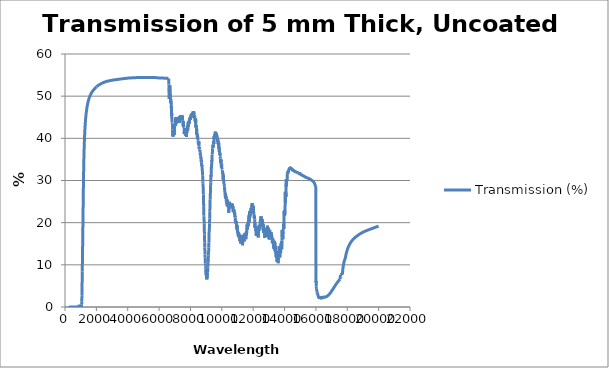
| Category | Transmission (%) |
|---|---|
| 200.0 | 0.035 |
| 210.0 | 0.001 |
| 220.0 | 0.003 |
| 230.0 | 0.002 |
| 240.0 | 0.006 |
| 250.0 | 0.004 |
| 260.0 | 0.007 |
| 270.0 | 0.01 |
| 280.0 | 0.009 |
| 290.0 | 0.01 |
| 300.0 | 0.008 |
| 310.0 | 0.002 |
| 320.0 | 0 |
| 330.0 | 0.002 |
| 340.0 | 0.003 |
| 350.0 | 0.001 |
| 360.0 | 0.004 |
| 370.0 | 0.001 |
| 380.0 | 0 |
| 390.0 | 0.001 |
| 400.0 | 0 |
| 410.0 | 0.002 |
| 420.0 | 0.002 |
| 430.0 | 0.002 |
| 440.0 | 0.003 |
| 450.0 | 0.001 |
| 460.0 | 0.001 |
| 470.0 | 0.006 |
| 480.0 | 0.008 |
| 490.0 | 0.001 |
| 500.0 | 0 |
| 510.0 | 0.003 |
| 520.0 | 0.005 |
| 530.0 | 0.008 |
| 540.0 | 0.008 |
| 550.0 | 0.003 |
| 560.0 | 0.001 |
| 570.0 | 0.005 |
| 580.0 | 0.006 |
| 590.0 | 0.004 |
| 600.0 | 0.006 |
| 610.0 | 0.007 |
| 620.0 | 0.005 |
| 630.0 | 0.007 |
| 640.0 | 0.005 |
| 650.0 | 0.003 |
| 660.0 | 0.006 |
| 670.0 | 0.006 |
| 680.0 | 0.003 |
| 690.0 | 0.005 |
| 700.0 | 0.006 |
| 710.0 | 0.004 |
| 720.0 | 0.006 |
| 730.0 | 0.007 |
| 740.0 | 0.004 |
| 750.0 | 0.005 |
| 760.0 | 0.005 |
| 770.0 | 0.003 |
| 780.0 | 0.005 |
| 790.0 | 0.005 |
| 800.0 | 0.005 |
| 810.0 | 0.005 |
| 820.0 | 0.003 |
| 830.0 | 0.006 |
| 840.0 | 0.005 |
| 850.0 | 0.025 |
| 860.0 | 0.058 |
| 870.0 | 0.173 |
| 880.0 | 0.228 |
| 890.0 | 0.239 |
| 900.0 | 0.217 |
| 910.0 | 0.198 |
| 920.0 | 0.178 |
| 930.0 | 0.204 |
| 940.0 | 0.229 |
| 950.0 | 0.2 |
| 960.0 | 0.166 |
| 970.0 | 0.136 |
| 980.0 | 0.11 |
| 990.0 | 0.09 |
| 1000.0 | 0.073 |
| 1010.0 | 0.096 |
| 1020.0 | 0.149 |
| 1030.0 | 0.175 |
| 1040.0 | 0.192 |
| 1050.0 | 0.255 |
| 1060.0 | 0.54 |
| 1070.0 | 1.258 |
| 1080.0 | 2.666 |
| 1090.0 | 5.006 |
| 1100.0 | 8.44 |
| 1110.0 | 10.669 |
| 1120.0 | 13.213 |
| 1130.0 | 15.979 |
| 1140.0 | 18.865 |
| 1150.0 | 21.82 |
| 1160.0 | 24.784 |
| 1170.0 | 27.65 |
| 1180.0 | 30.31 |
| 1190.0 | 32.607 |
| 1200.0 | 34.524 |
| 1210.0 | 36.13 |
| 1220.0 | 37.499 |
| 1230.0 | 38.69 |
| 1240.0 | 39.722 |
| 1250.0 | 40.62 |
| 1260.0 | 41.416 |
| 1270.0 | 42.127 |
| 1280.0 | 42.772 |
| 1290.0 | 43.359 |
| 1300.0 | 43.896 |
| 1310.0 | 44.389 |
| 1320.0 | 44.831 |
| 1330.0 | 45.226 |
| 1340.0 | 45.583 |
| 1350.0 | 45.913 |
| 1360.0 | 46.223 |
| 1370.0 | 46.508 |
| 1380.0 | 46.792 |
| 1390.0 | 47.058 |
| 1400.0 | 47.299 |
| 1410.0 | 47.528 |
| 1420.0 | 47.741 |
| 1430.0 | 47.939 |
| 1440.0 | 48.125 |
| 1450.0 | 48.299 |
| 1460.0 | 48.465 |
| 1470.0 | 48.625 |
| 1480.0 | 48.776 |
| 1490.0 | 48.919 |
| 1500.0 | 49.055 |
| 1510.0 | 49.184 |
| 1520.0 | 49.308 |
| 1530.0 | 49.426 |
| 1540.0 | 49.539 |
| 1550.0 | 49.647 |
| 1560.0 | 49.749 |
| 1570.0 | 49.847 |
| 1580.0 | 49.942 |
| 1590.0 | 50.034 |
| 1600.0 | 50.122 |
| 1610.0 | 50.207 |
| 1620.0 | 50.288 |
| 1630.0 | 50.365 |
| 1640.0 | 50.439 |
| 1650.0 | 50.512 |
| 1660.0 | 50.582 |
| 1670.0 | 50.65 |
| 1680.0 | 50.716 |
| 1690.0 | 50.78 |
| 1700.0 | 50.842 |
| 1710.0 | 50.903 |
| 1720.0 | 50.961 |
| 1730.0 | 51.015 |
| 1740.0 | 51.069 |
| 1750.0 | 51.122 |
| 1760.0 | 51.179 |
| 1770.0 | 51.244 |
| 1780.0 | 51.304 |
| 1790.0 | 51.353 |
| 1800.0 | 51.399 |
| 1810.0 | 51.442 |
| 1820.0 | 51.484 |
| 1830.0 | 51.526 |
| 1840.0 | 51.571 |
| 1850.0 | 51.612 |
| 1860.0 | 51.651 |
| 1870.0 | 51.703 |
| 1880.0 | 51.742 |
| 1890.0 | 51.773 |
| 1900.0 | 51.804 |
| 1910.0 | 51.835 |
| 1920.0 | 51.879 |
| 1930.0 | 51.927 |
| 1940.0 | 51.975 |
| 1950.0 | 52.021 |
| 1960.0 | 52.061 |
| 1970.0 | 52.1 |
| 1980.0 | 52.133 |
| 1990.0 | 52.164 |
| 2000.0 | 52.195 |
| 2000.06583409128 | 52.226 |
| 2009.94266750759 | 52.257 |
| 2020.09856612705 | 52.289 |
| 2029.96929826891 | 52.319 |
| 2039.8370004275 | 52.348 |
| 2049.98346034472 | 52.373 |
| 2059.84497072619 | 52.399 |
| 2069.98503080197 | 52.424 |
| 2079.84028883395 | 52.454 |
| 2089.97388678498 | 52.483 |
| 2099.82283193349 | 52.51 |
| 2109.94990551615 | 52.538 |
| 2120.0736471999 | 52.56 |
| 2129.91296429671 | 52.584 |
| 2140.03008788415 | 52.608 |
| 2149.86294050753 | 52.631 |
| 2159.97338385621 | 52.651 |
| 2169.79971160982 | 52.675 |
| 2179.90341261835 | 52.697 |
| 2190.00367126184 | 52.718 |
| 2199.82005175428 | 52.741 |
| 2209.91347454654 | 52.764 |
| 2220.00340758378 | 52.79 |
| 2229.80970387416 | 52.811 |
| 2239.89270764445 | 52.83 |
| 2249.97217431841 | 52.851 |
| 2259.76824960652 | 52.875 |
| 2269.84069369447 | 52.895 |
| 2279.90955339415 | 52.919 |
| 2289.97481280544 | 52.938 |
| 2299.75701491494 | 52.955 |
| 2309.81512717729 | 52.975 |
| 2319.86959192627 | 52.994 |
| 2329.92039328452 | 53.016 |
| 2339.6884784778 | 53.037 |
| 2349.73200830224 | 53.058 |
| 2359.77182757912 | 53.076 |
| 2369.80792045418 | 53.093 |
| 2379.84027107906 | 53.112 |
| 2389.86886361131 | 53.128 |
| 2399.89368221442 | 53.142 |
| 2409.63640045946 | 53.161 |
| 2419.65372964289 | 53.178 |
| 2429.66723786282 | 53.196 |
| 2439.67690930653 | 53.214 |
| 2449.6827281674 | 53.228 |
| 2459.68467864487 | 53.244 |
| 2469.68274494449 | 53.261 |
| 2479.67691127795 | 53.276 |
| 2489.66716186311 | 53.289 |
| 2499.65348092399 | 53.302 |
| 2509.63585269082 | 53.316 |
| 2519.61426140009 | 53.328 |
| 2529.58869129452 | 53.342 |
| 2539.83602598691 | 53.356 |
| 2549.80233938282 | 53.367 |
| 2559.76462629279 | 53.381 |
| 2569.72287098501 | 53.394 |
| 2579.67705773407 | 53.407 |
| 2589.62717082094 | 53.421 |
| 2599.57319453302 | 53.434 |
| 2609.79121882037 | 53.444 |
| 2619.72890198083 | 53.454 |
| 2629.66244823176 | 53.464 |
| 2639.59184188676 | 53.478 |
| 2649.51706726593 | 53.489 |
| 2659.71363330442 | 53.502 |
| 2669.63035823916 | 53.519 |
| 2679.54286746317 | 53.525 |
| 2689.7263147114 | 53.536 |
| 2699.63022736521 | 53.542 |
| 2709.52987693441 | 53.548 |
| 2719.70005797047 | 53.561 |
| 2729.59101496818 | 53.57 |
| 2739.47766156909 | 53.577 |
| 2749.63442916314 | 53.585 |
| 2759.5122873171 | 53.592 |
| 2769.65998937296 | 53.6 |
| 2779.52899494085 | 53.608 |
| 2789.66756556726 | 53.616 |
| 2799.52765446743 | 53.625 |
| 2809.65702783239 | 53.631 |
| 2819.50813604112 | 53.64 |
| 2829.62824637237 | 53.649 |
| 2839.47030992423 | 53.657 |
| 2849.58109150965 | 53.666 |
| 2859.41404649793 | 53.674 |
| 2869.51543368599 | 53.682 |
| 2879.61203427909 | 53.689 |
| 2889.43114346328 | 53.698 |
| 2899.51825084737 | 53.706 |
| 2909.60052158927 | 53.714 |
| 2919.40564020169 | 53.722 |
| 2929.4783190629 | 53.73 |
| 2939.54611130598 | 53.735 |
| 2949.33709478521 | 53.743 |
| 2959.39519661736 | 53.75 |
| 2969.44836192748 | 53.758 |
| 2979.49657394605 | 53.764 |
| 2989.5398159118 | 53.773 |
| 2999.57807107174 | 53.78 |
| 3009.34021965164 | 53.786 |
| 3019.36858687776 | 53.791 |
| 3029.39191754114 | 53.797 |
| 3039.41019492205 | 53.802 |
| 3049.42340230913 | 53.81 |
| 3059.43152299951 | 53.818 |
| 3069.43454029879 | 53.821 |
| 3079.4324375211 | 53.826 |
| 3089.4251979891 | 53.832 |
| 3099.41280503401 | 53.836 |
| 3109.39524199566 | 53.842 |
| 3119.37249222249 | 53.845 |
| 3129.34453907162 | 53.85 |
| 3139.31136590881 | 53.857 |
| 3149.27295610856 | 53.866 |
| 3159.22929305409 | 53.869 |
| 3169.44923460165 | 53.876 |
| 3179.39487211586 | 53.884 |
| 3189.33520612994 | 53.889 |
| 3199.27022006257 | 53.894 |
| 3209.19989734131 | 53.899 |
| 3219.39237192605 | 53.9 |
| 3229.31118085665 | 53.906 |
| 3239.22460302249 | 53.913 |
| 3249.40033103474 | 53.919 |
| 3259.30278335964 | 53.923 |
| 3269.19979889124 | 53.926 |
| 3279.35862480045 | 53.932 |
| 3289.24456916596 | 53.935 |
| 3299.39198988443 | 53.94 |
| 3309.2667953267 | 53.947 |
| 3319.13608063146 | 53.953 |
| 3329.26634014336 | 53.958 |
| 3339.12438548313 | 53.963 |
| 3349.2430665413 | 53.968 |
| 3359.35585470692 | 53.972 |
| 3369.19683760228 | 53.977 |
| 3379.2979428538 | 53.983 |
| 3389.12751656538 | 53.989 |
| 3399.21686967096 | 53.999 |
| 3409.30024195657 | 54.002 |
| 3419.1124986363 | 54.007 |
| 3429.18401461892 | 54.013 |
| 3439.24949705528 | 54.019 |
| 3449.30892823547 | 54.022 |
| 3459.09780619876 | 54.024 |
| 3469.14524218086 | 54.027 |
| 3479.18657430612 | 54.033 |
| 3489.22178490713 | 54.037 |
| 3499.25085632722 | 54.043 |
| 3509.27377092055 | 54.047 |
| 3519.02699188112 | 54.051 |
| 3529.03770310207 | 54.056 |
| 3539.04220508721 | 54.059 |
| 3549.04048023391 | 54.066 |
| 3559.0325109505 | 54.07 |
| 3569.0182796563 | 54.077 |
| 3578.99776878166 | 54.082 |
| 3589.23332799103 | 54.086 |
| 3599.20003887791 | 54.091 |
| 3609.16041708046 | 54.094 |
| 3619.11444507367 | 54.099 |
| 3629.06210534374 | 54.102 |
| 3639.00338038806 | 54.107 |
| 3649.19961010111 | 54.11 |
| 3659.12789304255 | 54.114 |
| 3669.04973785839 | 54.122 |
| 3678.96512709144 | 54.123 |
| 3689.13471667679 | 54.13 |
| 3699.03697138116 | 54.137 |
| 3708.93271774111 | 54.144 |
| 3719.08209270929 | 54.153 |
| 3728.9645977349 | 54.157 |
| 3739.10034626381 | 54.164 |
| 3748.96953856087 | 54.168 |
| 3759.09158742681 | 54.169 |
| 3768.94739569729 | 54.174 |
| 3779.05567177552 | 54.18 |
| 3788.89802481807 | 54.185 |
| 3798.99245508334 | 54.19 |
| 3809.07984470592 | 54.194 |
| 3818.90179332094 | 54.198 |
| 3828.97522730752 | 54.203 |
| 3839.04156508458 | 54.206 |
| 3849.10078799625 | 54.209 |
| 3858.89522078111 | 54.213 |
| 3868.94034166794 | 54.218 |
| 3878.97829227822 | 54.223 |
| 3889.00905400868 | 54.226 |
| 3899.03260826941 | 54.228 |
| 3909.04893648382 | 54.233 |
| 3919.05802008873 | 54.236 |
| 3928.80347448211 | 54.238 |
| 3938.79820017381 | 54.244 |
| 3949.04161781629 | 54.249 |
| 3959.02153762044 | 54.255 |
| 3968.99412020128 | 54.261 |
| 3978.95934707668 | 54.265 |
| 3988.91719977817 | 54.27 |
| 3998.86765985095 | 54.273 |
| 4008.8107088539 | 54.277 |
| 4019.00098997837 | 54.28 |
| 4028.92897035924 | 54.286 |
| 4038.8494839579 | 54.291 |
| 4048.76251238873 | 54.294 |
| 4058.92192626883 | 54.3 |
| 4068.81973615228 | 54.302 |
| 4078.96350265228 | 54.308 |
| 4088.8460187208 | 54.307 |
| 4098.72095696331 | 54.308 |
| 4108.84120780513 | 54.311 |
| 4118.70074002454 | 54.315 |
| 4128.80515135257 | 54.317 |
| 4138.90151336369 | 54.323 |
| 4148.73769754802 | 54.324 |
| 4158.8181043472 | 54.323 |
| 4168.89040331766 | 54.328 |
| 4178.70306974628 | 54.33 |
| 4188.75929808195 | 54.336 |
| 4198.80736021703 | 54.338 |
| 4208.84723656231 | 54.337 |
| 4218.87890754453 | 54.332 |
| 4228.65186785294 | 54.332 |
| 4238.66727580289 | 54.332 |
| 4248.6744202541 | 54.335 |
| 4258.67328169711 | 54.34 |
| 4268.66384063866 | 54.338 |
| 4278.64607760161 | 54.337 |
| 4288.6199731251 | 54.341 |
| 4298.83453883861 | 54.345 |
| 4308.79148340901 | 54.348 |
| 4318.74002776994 | 54.351 |
| 4328.68015252619 | 54.354 |
| 4338.61183829899 | 54.358 |
| 4348.78303787177 | 54.362 |
| 4358.69757541715 | 54.368 |
| 4368.60361545856 | 54.369 |
| 4378.74846747569 | 54.371 |
| 4388.63724093891 | 54.373 |
| 4398.76435418029 | 54.378 |
| 4408.63578201077 | 54.379 |
| 4418.74507551645 | 54.382 |
| 4428.59907879829 | 54.384 |
| 4438.69047175081 | 54.384 |
| 4448.52697170743 | 54.387 |
| 4458.60038343241 | 54.385 |
| 4468.66466284172 | 54.385 |
| 4478.71978932123 | 54.385 |
| 4488.5208283377 | 54.387 |
| 4498.5578116813 | 54.389 |
| 4508.58558086654 | 54.393 |
| 4518.60411535408 | 54.395 |
| 4528.61339462348 | 54.398 |
| 4538.61339817326 | 54.397 |
| 4548.60410552094 | 54.398 |
| 4558.58549620308 | 54.402 |
| 4568.55754977533 | 54.404 |
| 4578.52024581246 | 54.406 |
| 4588.4735639084 | 54.407 |
| 4598.65990072383 | 54.409 |
| 4608.59417181752 | 54.412 |
| 4618.51900337118 | 54.413 |
| 4628.43437505631 | 54.411 |
| 4638.58175507092 | 54.411 |
| 4648.47791413899 | 54.413 |
| 4658.60557036814 | 54.411 |
| 4668.48243375049 | 54.412 |
| 4678.59028118231 | 54.414 |
| 4688.44776597221 | 54.415 |
| 4698.53571976111 | 54.416 |
| 4708.61357461071 | 54.417 |
| 4718.44171868192 | 54.417 |
| 4728.49955242443 | 54.418 |
| 4738.54722282397 | 54.419 |
| 4748.58470828426 | 54.42 |
| 4758.37336127226 | 54.421 |
| 4768.39065592857 | 54.421 |
| 4778.39770150076 | 54.424 |
| 4788.39447647988 | 54.423 |
| 4798.38095937907 | 54.424 |
| 4808.35712873357 | 54.426 |
| 4818.3229631008 | 54.426 |
| 4828.51534984788 | 54.427 |
| 4838.46020265051 | 54.43 |
| 4848.39465576292 | 54.432 |
| 4858.3186878322 | 54.434 |
| 4868.46818792866 | 54.435 |
| 4878.37106454777 | 54.437 |
| 4888.49886084155 | 54.439 |
| 4898.38049483114 | 54.439 |
| 4908.48649816283 | 54.439 |
| 4918.34680253056 | 54.439 |
| 4928.43092393258 | 54.44 |
| 4938.26981187388 | 54.44 |
| 4948.33196257132 | 54.44 |
| 4958.38296492419 | 54.439 |
| 4968.4227962881 | 54.44 |
| 4978.4514340438 | 54.441 |
| 4988.23601986218 | 54.438 |
| 4998.24246426758 | 54.438 |
| 5008.5320413709 | 54.438 |
| 5018.35107824587 | 54.44 |
| 5028.16908173511 | 54.441 |
| 5037.98604981686 | 54.441 |
| 5048.5570090299 | 54.44 |
| 5058.37182019091 | 54.442 |
| 5068.18558972505 | 54.442 |
| 5077.99831561147 | 54.441 |
| 5088.56469709201 | 54.44 |
| 5098.3752489461 | 54.439 |
| 5108.18475093576 | 54.44 |
| 5117.993201041 | 54.439 |
| 5128.55496862371 | 54.439 |
| 5138.36122759249 | 54.44 |
| 5148.16642846288 | 54.44 |
| 5157.97056921577 | 54.439 |
| 5168.52768675108 | 54.439 |
| 5178.32961927087 | 54.438 |
| 5188.13048546191 | 54.439 |
| 5197.93028330601 | 54.439 |
| 5208.48271466029 | 54.439 |
| 5218.2802871822 | 54.439 |
| 5228.07678514867 | 54.44 |
| 5237.87220654239 | 54.44 |
| 5248.41991559805 | 54.439 |
| 5258.21309458812 | 54.439 |
| 5268.00519079973 | 54.44 |
| 5278.5493119507 | 54.438 |
| 5288.33915287207 | 54.438 |
| 5298.12790481138 | 54.436 |
| 5307.91556575293 | 54.435 |
| 5318.45490126825 | 54.436 |
| 5328.24028985158 | 54.437 |
| 5338.02458123637 | 54.437 |
| 5347.80777340781 | 54.437 |
| 5358.34228721469 | 54.438 |
| 5368.12318996774 | 54.438 |
| 5377.9029873095 | 54.437 |
| 5388.43383821533 | 54.438 |
| 5398.21133326827 | 54.437 |
| 5407.98771671413 | 54.438 |
| 5417.76298653973 | 54.437 |
| 5428.28895247958 | 54.439 |
| 5438.06190296998 | 54.439 |
| 5447.83373364721 | 54.44 |
| 5458.35598896381 | 54.438 |
| 5468.12548744588 | 54.438 |
| 5477.89385992406 | 54.44 |
| 5488.41238410373 | 54.441 |
| 5498.17841153135 | 54.44 |
| 5507.94330676652 | 54.44 |
| 5517.70706779845 | 54.44 |
| 5528.22061663666 | 54.438 |
| 5537.98201559167 | 54.437 |
| 5547.74227415782 | 54.436 |
| 5558.252044193 | 54.43 |
| 5568.00992783749 | 54.429 |
| 5577.76666490975 | 54.427 |
| 5588.27263565256 | 54.426 |
| 5598.02698496305 | 54.425 |
| 5607.78018152015 | 54.423 |
| 5618.28233248867 | 54.421 |
| 5628.03312844856 | 54.421 |
| 5637.78276547613 | 54.421 |
| 5648.28107619589 | 54.419 |
| 5658.02829979549 | 54.421 |
| 5667.77435828614 | 54.417 |
| 5678.26880829012 | 54.415 |
| 5688.01244052673 | 54.415 |
| 5697.75490148001 | 54.414 |
| 5708.24547030876 | 54.41 |
| 5717.98549218666 | 54.407 |
| 5727.72433660915 | 54.403 |
| 5738.21100381076 | 54.402 |
| 5747.94739634129 | 54.399 |
| 5757.6826052466 | 54.399 |
| 5768.16535037678 | 54.398 |
| 5777.89809457834 | 54.392 |
| 5787.6296489872 | 54.389 |
| 5798.1084516093 | 54.383 |
| 5807.83752850741 | 54.379 |
| 5817.56540944764 | 54.374 |
| 5828.04024913271 | 54.371 |
| 5837.76563976003 | 54.369 |
| 5847.48982826663 | 54.363 |
| 5857.96068459343 | 54.361 |
| 5867.68236998981 | 54.356 |
| 5878.1505260093 | 54.357 |
| 5887.86969966004 | 54.353 |
| 5897.58766087257 | 54.352 |
| 5908.05179934563 | 54.35 |
| 5917.76723602339 | 54.346 |
| 5927.4814541064 | 54.344 |
| 5937.94155463266 | 54.342 |
| 5947.6532353967 | 54.338 |
| 5958.11059878025 | 54.334 |
| 5967.81973359879 | 54.332 |
| 5977.52763951569 | 54.335 |
| 5987.98093079947 | 54.332 |
| 5997.68627799497 | 54.331 |
| 6008.13680909029 | 54.328 |
| 6017.83958894346 | 54.327 |
| 6027.54112959485 | 54.328 |
| 6037.9875544597 | 54.324 |
| 6047.68651500124 | 54.325 |
| 6057.38423019488 | 54.322 |
| 6067.82652846342 | 54.32 |
| 6077.5216507847 | 54.32 |
| 6087.96115209172 | 54.317 |
| 6097.65367292883 | 54.317 |
| 6108.0903680013 | 54.316 |
| 6117.78027874469 | 54.313 |
| 6127.46892970638 | 54.31 |
| 6137.90145035456 | 54.309 |
| 6147.58747847197 | 54.307 |
| 6158.01716988551 | 54.307 |
| 6167.70056655487 | 54.307 |
| 6177.38269316287 | 54.304 |
| 6187.80817608937 | 54.302 |
| 6197.48765850733 | 54.299 |
| 6207.91028921457 | 54.297 |
| 6217.58711884456 | 54.294 |
| 6228.00688807451 | 54.29 |
| 6237.68105632093 | 54.289 |
| 6247.35394009551 | 54.287 |
| 6257.76945308771 | 54.287 |
| 6267.43966274888 | 54.286 |
| 6277.8522913011 | 54.284 |
| 6287.51981825916 | 54.282 |
| 6297.92955312224 | 54.279 |
| 6307.59438878986 | 54.277 |
| 6317.25792558899 | 54.274 |
| 6327.66335650945 | 54.273 |
| 6337.32418930059 | 54.27 |
| 6347.72670359139 | 54.268 |
| 6357.38482379317 | 54.269 |
| 6367.78441221412 | 54.267 |
| 6377.43981124757 | 54.263 |
| 6387.83646456109 | 54.261 |
| 6397.48913384967 | 54.258 |
| 6407.88284282078 | 54.254 |
| 6417.53277379037 | 54.251 |
| 6427.1813832528 | 54.248 |
| 6437.57071326561 | 54.249 |
| 6447.21657171111 | 54.245 |
| 6457.60293447642 | 54.242 |
| 6467.24603333692 | 54.24 |
| 6477.62941962888 | 54.237 |
| 6487.26975033877 | 54.236 |
| 6497.65015093418 | 54.231 |
| 6507.28770493029 | 54.232 |
| 6517.66511060862 | 54.229 |
| 6527.29987933026 | 54.228 |
| 6537.67428087363 | 54.225 |
| 6547.30625576257 | 54.224 |
| 6557.67764395577 | 54.219 |
| 6567.30681645627 | 54.218 |
| 6577.67518208677 | 54.214 |
| 6587.30154364558 | 54.211 |
| 6597.66687750353 | 54.21 |
| 6607.2904195699 | 54.21 |
| 6617.65271244814 | 52.804 |
| 6627.27342647382 | 52.649 |
| 6637.63266916789 | 51.633 |
| 6647.25054660715 | 49.342 |
| 6657.6067299153 | 52.211 |
| 6667.22176222492 | 52.436 |
| 6677.57487694813 | 50.63 |
| 6687.18705558741 | 52.566 |
| 6697.53709252939 | 51.23 |
| 6707.14640896018 | 50.563 |
| 6717.49335892734 | 49.937 |
| 6727.09980461403 | 50.485 |
| 6737.44365841555 | 48.34 |
| 6747.04722482508 | 49.332 |
| 6757.38797327289 | 48.36 |
| 6766.98865187474 | 48.448 |
| 6777.32628578352 | 47.205 |
| 6787.66230113088 | 47.658 |
| 6797.25857823695 | 45.291 |
| 6807.5914651025 | 45.991 |
| 6817.18483292805 | 44.344 |
| 6827.51458213344 | 43.752 |
| 6837.10503215703 | 43.515 |
| 6847.43163452672 | 43.507 |
| 6857.01915822948 | 42.087 |
| 6867.34260459073 | 40.845 |
| 6876.9271934564 | 40.452 |
| 6887.24747463925 | 41.212 |
| 6897.5661110093 | 40.459 |
| 6907.14622699151 | 41.365 |
| 6917.4616842638 | 41.216 |
| 6927.03884397215 | 41.26 |
| 6937.35111298383 | 40.728 |
| 6946.92530791127 | 41.266 |
| 6957.23437950232 | 40.81 |
| 6967.54178956629 | 41.789 |
| 6977.11146615767 | 41.102 |
| 6987.41566489678 | 42.428 |
| 6996.98235529378 | 43.208 |
| 7007.28333355518 | 42.954 |
| 7016.84702926004 | 43.282 |
| 7027.14477789373 | 43.071 |
| 7037.44084830435 | 43.902 |
| 7046.99998027025 | 43.03 |
| 7057.29280716421 | 45.011 |
| 7066.84892304803 | 44.257 |
| 7077.13849728261 | 44.276 |
| 7087.42638135459 | 45.059 |
| 7096.97790103131 | 43.371 |
| 7107.26251856599 | 44.409 |
| 7116.81100078769 | 45.026 |
| 7127.09234264961 | 44.016 |
| 7137.37198241895 | 43.82 |
| 7146.91583599132 | 44.25 |
| 7157.1921862211 | 44.912 |
| 7167.46682716988 | 44.434 |
| 7177.00603254473 | 44.638 |
| 7187.27737009388 | 43.938 |
| 7196.8135037899 | 44.098 |
| 7207.08152881577 | 44.407 |
| 7217.34783264605 | 43.752 |
| 7226.8792857442 | 44.12 |
| 7237.14226320238 | 44.483 |
| 7247.40351228586 | 45.086 |
| 7256.93026526338 | 44.561 |
| 7267.18817413275 | 44.407 |
| 7276.71182125208 | 44.361 |
| 7286.9663807956 | 44.832 |
| 7297.21920006543 | 43.647 |
| 7306.73811470614 | 45.247 |
| 7316.98757081948 | 44.71 |
| 7327.23527948945 | 44.384 |
| 7336.74944215446 | 44.729 |
| 7346.99377384418 | 45.021 |
| 7357.23635092447 | 45.057 |
| 7366.74574212641 | 45.068 |
| 7376.98492840961 | 44.904 |
| 7387.22235292088 | 45.542 |
| 7396.72695318216 | 44.937 |
| 7406.96097308644 | 45.406 |
| 7417.19322405992 | 45.358 |
| 7426.69301391278 | 44.568 |
| 7436.92184647635 | 45.12 |
| 7447.14890295385 | 45.258 |
| 7456.64386294037 | 44.443 |
| 7466.86748721205 | 44.331 |
| 7477.08932824603 | 45.449 |
| 7487.30938360115 | 44.859 |
| 7496.79783395746 | 44.219 |
| 7507.01443861108 | 44.08 |
| 7517.22925043911 | 44.187 |
| 7526.71282540785 | 43.686 |
| 7536.92417275496 | 42.817 |
| 7547.13372013345 | 43.991 |
| 7556.6124002899 | 43.335 |
| 7566.81846941515 | 42.806 |
| 7577.02273143241 | 42.618 |
| 7587.22518390471 | 42.644 |
| 7596.69726736074 | 42.573 |
| 7606.89622311593 | 41.064 |
| 7617.09336219176 | 42.406 |
| 7626.56050539257 | 41.424 |
| 7636.7541339957 | 41.915 |
| 7646.94593878881 | 40.902 |
| 7657.13591733789 | 40.964 |
| 7666.59640291535 | 41.442 |
| 7676.7828525504 | 41.569 |
| 7686.96746881576 | 42.061 |
| 7697.15024927916 | 41.855 |
| 7706.60404236314 | 40.572 |
| 7716.78327548419 | 41.05 |
| 7726.96066568264 | 41.065 |
| 7737.13621052795 | 40.801 |
| 7746.58327627302 | 40.324 |
| 7756.75525536073 | 42.037 |
| 7766.92538197974 | 41.728 |
| 7777.09365370122 | 41.278 |
| 7786.53395728673 | 42.111 |
| 7796.69864484851 | 41.849 |
| 7806.86147040231 | 42.803 |
| 7817.02243152106 | 43.017 |
| 7826.45593815126 | 41.863 |
| 7836.61329672141 | 43.217 |
| 7846.76878375116 | 43.735 |
| 7856.92239681518 | 43.81 |
| 7867.07413348858 | 42.721 |
| 7876.49906385922 | 43.589 |
| 7886.64717493311 | 43.376 |
| 7896.79340251751 | 44.018 |
| 7906.9377441893 | 43.594 |
| 7916.3557992482 | 44.234 |
| 7926.49649696162 | 43.501 |
| 7936.63530166874 | 44.715 |
| 7946.77221094819 | 44.545 |
| 7956.90722237909 | 44.536 |
| 7967.04033354099 | 44.772 |
| 7976.4479474168 | 45.029 |
| 7986.5773869406 | 44.715 |
| 7996.70491910956 | 44.974 |
| 8006.83054150504 | 44.378 |
| 8016.95425170883 | 45.33 |
| 8026.35312544983 | 45.444 |
| 8036.47314102809 | 45.525 |
| 8046.59123733543 | 44.874 |
| 8056.70741195542 | 45.64 |
| 8066.82166247212 | 45.074 |
| 8076.93398647006 | 45.935 |
| 8086.32227447941 | 45.765 |
| 8096.4308762287 | 45.024 |
| 8106.53754438795 | 45.294 |
| 8116.64227654347 | 46.068 |
| 8126.74507028207 | 45.939 |
| 8136.84592319098 | 45.295 |
| 8146.94483285792 | 45.023 |
| 8156.32064973148 | 45.346 |
| 8166.41580490695 | 46.376 |
| 8176.50900977857 | 45.436 |
| 8186.60026193588 | 45.945 |
| 8196.68955896888 | 45.67 |
| 8206.77689846806 | 45.266 |
| 8216.86227802435 | 46.415 |
| 8226.22551627242 | 45.337 |
| 8236.30710913745 | 45.472 |
| 8246.38673500719 | 45.473 |
| 8256.46439147441 | 44.726 |
| 8266.54007613237 | 45.236 |
| 8276.6137865748 | 44.895 |
| 8286.68552039589 | 44.577 |
| 8296.75527519032 | 44.021 |
| 8306.82304855321 | 44.728 |
| 8316.1699189557 | 44.812 |
| 8326.23386419684 | 43.527 |
| 8336.29582096637 | 44.528 |
| 8346.35578686129 | 42.571 |
| 8356.41375947909 | 43.121 |
| 8366.46973641771 | 43.181 |
| 8376.5237152756 | 42.677 |
| 8386.57569365165 | 40.912 |
| 8396.62566914525 | 42.133 |
| 8406.67363935628 | 41.453 |
| 8416.71960188506 | 40.952 |
| 8426.76355433243 | 41.105 |
| 8436.088279665 | 40.336 |
| 8446.12834875333 | 40.02 |
| 8456.16640073684 | 40.669 |
| 8466.20243321826 | 40.177 |
| 8476.23644380076 | 39.567 |
| 8486.26843008803 | 39.528 |
| 8496.29838968424 | 39.001 |
| 8506.32632019401 | 38.673 |
| 8516.35221922249 | 38.733 |
| 8526.37608437529 | 38.564 |
| 8536.3979132585 | 39.327 |
| 8546.41770347871 | 38.115 |
| 8556.43545264301 | 37.521 |
| 8566.45115835894 | 37.869 |
| 8576.46481823455 | 37.666 |
| 8586.47642987839 | 37.464 |
| 8596.48599089948 | 37.274 |
| 8606.49349890733 | 37.326 |
| 8616.49895151196 | 36.73 |
| 8626.50234632385 | 35.991 |
| 8636.50368095401 | 36.311 |
| 8646.5029530139 | 36.026 |
| 8656.5001601155 | 35.986 |
| 8666.49529987128 | 35.225 |
| 8676.4883698942 | 35.413 |
| 8686.47936779772 | 34.35 |
| 8696.46829119577 | 34.756 |
| 8706.45513770282 | 34.325 |
| 8716.43990493379 | 33.464 |
| 8726.42259050413 | 33.668 |
| 8736.40319202976 | 33.199 |
| 8746.38170712714 | 32.808 |
| 8756.35813341317 | 32.341 |
| 8766.33246850529 | 32.02 |
| 8776.30471002144 | 31.219 |
| 8786.27485558003 | 29.794 |
| 8796.24290280001 | 29.3 |
| 8806.20884930079 | 28.675 |
| 8816.17269270231 | 27.874 |
| 8826.13443062501 | 26.701 |
| 8836.09406068983 | 24.904 |
| 8846.0515805182 | 23.742 |
| 8856.00698773206 | 21.643 |
| 8865.96027995388 | 21.521 |
| 8875.91145480659 | 19.766 |
| 8885.86050991367 | 18.011 |
| 8896.51785684591 | 17.201 |
| 8906.46251349343 | 15.232 |
| 8916.40504309911 | 14.094 |
| 8926.34544328846 | 12.426 |
| 8936.28371168753 | 11.786 |
| 8946.21984592286 | 10.315 |
| 8956.15384362149 | 9.885 |
| 8966.085702411 | 9.859 |
| 8976.01541991944 | 9.188 |
| 8985.94299377542 | 8.003 |
| 8995.86842160801 | 7.693 |
| 9005.79170104684 | 8.209 |
| 9016.42139940802 | 7.426 |
| 9026.34022106433 | 7.287 |
| 9036.2568870496 | 6.526 |
| 9046.17139499552 | 7.731 |
| 9056.08374253431 | 6.753 |
| 9065.99392729871 | 7.13 |
| 9075.90194692197 | 7.626 |
| 9085.80779903785 | 7.828 |
| 9095.71148128064 | 8.234 |
| 9106.32015881589 | 9.359 |
| 9116.21933879816 | 9.56 |
| 9126.11634164444 | 10.483 |
| 9136.01116499115 | 11.23 |
| 9145.90380647519 | 12.25 |
| 9155.794263734 | 12.788 |
| 9165.68253440555 | 14.031 |
| 9176.27468099962 | 15.214 |
| 9186.15841480015 | 17.065 |
| 9196.03995476185 | 18.573 |
| 9205.9192985248 | 18.513 |
| 9215.79644372962 | 19.789 |
| 9225.67138801746 | 20.933 |
| 9236.24924044527 | 22.698 |
| 9246.11961818922 | 24.637 |
| 9255.98778777439 | 25.556 |
| 9265.85374684408 | 26.497 |
| 9275.71749304209 | 27.603 |
| 9286.28333425352 | 28.902 |
| 9296.14248915287 | 29.542 |
| 9305.99942394698 | 31.291 |
| 9315.85413628183 | 30.949 |
| 9325.7066238039 | 32.729 |
| 9336.26038890034 | 33.298 |
| 9346.10826039718 | 32.91 |
| 9355.95389985596 | 34.847 |
| 9365.79730492534 | 34.571 |
| 9375.63847325452 | 36.11 |
| 9386.18009741156 | 36.156 |
| 9396.01662501729 | 36.49 |
| 9405.85090866584 | 37.211 |
| 9415.68294600858 | 37.558 |
| 9426.21477635345 | 37.615 |
| 9436.04215316522 | 38.476 |
| 9445.86727646091 | 37.861 |
| 9455.69014389408 | 38.458 |
| 9465.51075311883 | 38.505 |
| 9476.03032584643 | 39.353 |
| 9485.84624989349 | 38.713 |
| 9495.65990853026 | 38.657 |
| 9506.17202620929 | 40.492 |
| 9515.98098475547 | 39.898 |
| 9525.78767069456 | 40.342 |
| 9535.59208168454 | 40.723 |
| 9546.09428058795 | 39.901 |
| 9555.8939717354 | 41.077 |
| 9565.69138074375 | 41.031 |
| 9575.48650527319 | 40.39 |
| 9585.97874382479 | 41.59 |
| 9595.76912877843 | 40.721 |
| 9605.55722206999 | 41.532 |
| 9616.04191918323 | 40.926 |
| 9625.82525802492 | 40.739 |
| 9635.60629802653 | 41.114 |
| 9646.0834300799 | 40.745 |
| 9655.85970076827 | 41.229 |
| 9665.63366544371 | 41.03 |
| 9675.40532177202 | 40.127 |
| 9685.87238934236 | 40.681 |
| 9695.6392566714 | 39.764 |
| 9705.40380848737 | 39.972 |
| 9715.86325613013 | 39.631 |
| 9725.62300410849 | 39.865 |
| 9735.38042941307 | 39.126 |
| 9745.83223356363 | 39.927 |
| 9755.58484020311 | 38.62 |
| 9766.03147614372 | 38.891 |
| 9775.77925412428 | 39.303 |
| 9785.52469745272 | 39.304 |
| 9795.9636504827 | 38.075 |
| 9805.70425034291 | 38.906 |
| 9815.44250840433 | 37.39 |
| 9825.87375500523 | 38.047 |
| 9835.60715480002 | 36.773 |
| 9845.3382056546 | 37.147 |
| 9855.76172232536 | 36.75 |
| 9865.48790012586 | 36.453 |
| 9875.90619032727 | 36.109 |
| 9885.62748510697 | 36.551 |
| 9895.3464190006 | 35.686 |
| 9905.75693996023 | 35.262 |
| 9915.47097606401 | 34.612 |
| 9925.87624405834 | 34.262 |
| 9935.58537241796 | 34.136 |
| 9945.29212796057 | 35.048 |
| 9955.68958745058 | 34.939 |
| 9965.39142049849 | 33.1 |
| 9975.78360056041 | 33.197 |
| 9985.48050117184 | 33.794 |
| 9995.86739115646 | 33.898 |
| 10005.5593493947 | 32.751 |
| 10015.2489181047 | 32.625 |
| 10025.6279445915 | 32.476 |
| 10035.3125562038 | 32.447 |
| 10045.6862661974 | 31.519 |
| 10055.3659107879 | 31.57 |
| 10065.734293658 | 31.896 |
| 10075.4089613077 | 30.912 |
| 10085.7720064294 | 30.161 |
| 10095.4416872242 | 31.315 |
| 10105.7993839782 | 31.03 |
| 10115.4640680094 | 30.152 |
| 10125.8164057818 | 29.557 |
| 10135.4760831456 | 29.296 |
| 10145.1333399545 | 29.27 |
| 10155.4777121259 | 29.144 |
| 10165.129947592 | 28.513 |
| 10175.468934454 | 27.876 |
| 10185.1161386864 | 28.039 |
| 10195.4497296441 | 27.253 |
| 10205.7805254614 | 26.496 |
| 10215.4200772213 | 26.538 |
| 10225.7454610703 | 26.114 |
| 10235.3799567214 | 27.053 |
| 10245.6999180212 | 25.663 |
| 10255.3293476907 | 26.489 |
| 10265.6438758662 | 25.971 |
| 10275.2682296865 | 26.129 |
| 10285.5773141681 | 25.048 |
| 10295.1965822768 | 24.746 |
| 10305.5002125004 | 24.832 |
| 10315.1143850403 | 24.865 |
| 10325.4125504474 | 24.268 |
| 10335.707885084 | 24.033 |
| 10345.3143076043 | 24.901 |
| 10355.6041614154 | 25.482 |
| 10365.2054635772 | 24.439 |
| 10375.4898260184 | 23.909 |
| 10385.0859979829 | 24.291 |
| 10395.3648585155 | 23.722 |
| 10405.6408690999 | 24.234 |
| 10415.2292385401 | 23.652 |
| 10425.4997312369 | 24.233 |
| 10435.0829457365 | 24.214 |
| 10445.3479100211 | 22.324 |
| 10455.6100106543 | 23.898 |
| 10465.1853851135 | 24.005 |
| 10475.4419413772 | 23.557 |
| 10485.0121361861 | 24.985 |
| 10495.26313757 | 23.707 |
| 10505.511261618 | 23.816 |
| 10515.0735789212 | 23.4 |
| 10525.3161321538 | 23.734 |
| 10535.5557998112 | 23.83 |
| 10545.1102170517 | 24.031 |
| 10555.3442979711 | 24.28 |
| 10565.575485083 | 23.758 |
| 10575.1219797223 | 24.512 |
| 10585.3475641868 | 24.385 |
| 10594.8888247979 | 24.594 |
| 10605.1087961366 | 23.846 |
| 10615.3258600246 | 24.277 |
| 10625.5400136608 | 24.194 |
| 10635.0705955571 | 24.35 |
| 10645.2791147669 | 24.535 |
| 10655.484715513 | 24.06 |
| 10665.0073073051 | 23.494 |
| 10675.2072577552 | 23.455 |
| 10685.4042815367 | 24.365 |
| 10694.9188607612 | 23.454 |
| 10705.1102183904 | 23.9 |
| 10715.298641153 | 23.153 |
| 10725.4841262556 | 22.504 |
| 10734.9879261327 | 23.295 |
| 10745.1677238422 | 22.686 |
| 10755.3445757031 | 22.523 |
| 10764.8403105018 | 23.168 |
| 10775.0114591447 | 22.901 |
| 10785.179653757 | 22.779 |
| 10795.3448915512 | 22.412 |
| 10804.8297766602 | 22.592 |
| 10814.9892900376 | 21.926 |
| 10825.1458384244 | 22.3 |
| 10835.2994190361 | 21.346 |
| 10844.7734142254 | 21.666 |
| 10854.921249246 | 21.211 |
| 10865.0661083283 | 20.217 |
| 10875.2079886912 | 20.8 |
| 10885.3468875541 | 20.647 |
| 10894.8071673986 | 20.447 |
| 10904.9402941472 | 19.769 |
| 10915.0704312445 | 20.332 |
| 10925.1975759134 | 20.046 |
| 10935.3217253775 | 19.069 |
| 10944.7682267549 | 18.841 |
| 10954.8865776199 | 19.325 |
| 10965.0019251406 | 18.312 |
| 10975.1142665438 | 18.834 |
| 10985.2235990572 | 19.383 |
| 10995.3299199093 | 17.649 |
| 11004.7597664058 | 18.391 |
| 11014.8602568568 | 17.629 |
| 11024.9577275214 | 17.76 |
| 11035.0521756313 | 17.563 |
| 11045.1435984191 | 16.829 |
| 11055.2319931181 | 17.688 |
| 11064.6450937216 | 16.896 |
| 11074.7276262738 | 17.587 |
| 11084.8071226267 | 16.468 |
| 11094.8835800168 | 16.824 |
| 11104.9569956817 | 17.272 |
| 11115.0273668596 | 16.976 |
| 11125.0946907897 | 16.273 |
| 11135.158964712 | 16.083 |
| 11145.2201858674 | 15.609 |
| 11154.6079022381 | 15.905 |
| 11164.6632135566 | 16.99 |
| 11174.7154640193 | 15.932 |
| 11184.7646508705 | 16.352 |
| 11194.8107713549 | 15.599 |
| 11204.8538227185 | 15.045 |
| 11214.8938022079 | 16.536 |
| 11224.9307070705 | 15.782 |
| 11234.9645345547 | 15.499 |
| 11244.9952819096 | 15.256 |
| 11255.0229463854 | 16.19 |
| 11265.0475252327 | 15.522 |
| 11275.0690157034 | 16.163 |
| 11285.0874150499 | 17.076 |
| 11295.1027205258 | 14.95 |
| 11305.1149293852 | 16.391 |
| 11315.1240388832 | 14.623 |
| 11325.1300462757 | 14.821 |
| 11335.1329488197 | 15.953 |
| 11345.1327437726 | 15.985 |
| 11355.1294283931 | 16.844 |
| 11365.1229999404 | 17.125 |
| 11375.1134556748 | 16.043 |
| 11385.1007928573 | 15.677 |
| 11395.0850087499 | 16.427 |
| 11405.0661006153 | 16.368 |
| 11415.0440657171 | 16.665 |
| 11425.0189013199 | 15.545 |
| 11434.990604689 | 16.442 |
| 11444.9591730905 | 16.286 |
| 11454.9246037915 | 16.58 |
| 11464.88689406 | 17.535 |
| 11474.8460411647 | 17.014 |
| 11484.8020423753 | 16.312 |
| 11494.7548949623 | 16.361 |
| 11504.7045961971 | 16.443 |
| 11514.6511433518 | 16.878 |
| 11524.5945336996 | 17.208 |
| 11534.5347645145 | 16.05 |
| 11544.4718330712 | 17.294 |
| 11554.4057366455 | 17.834 |
| 11564.9984088756 | 16.972 |
| 11574.925762857 | 17.932 |
| 11584.8499435067 | 17.585 |
| 11594.7709481042 | 18.048 |
| 11604.6887739295 | 19.563 |
| 11614.6034182635 | 19.197 |
| 11624.5148783881 | 18.291 |
| 11634.423151586 | 19.454 |
| 11644.3282351409 | 18.745 |
| 11654.8901388442 | 18.922 |
| 11664.7886218658 | 19.33 |
| 11674.6839069194 | 20.033 |
| 11684.5759912921 | 19.176 |
| 11694.4648722721 | 20.302 |
| 11704.3505471483 | 20.045 |
| 11714.8917301236 | 21.07 |
| 11724.7707704643 | 21.318 |
| 11734.6465963927 | 21.728 |
| 11744.5192052011 | 20.111 |
| 11754.388594183 | 21.727 |
| 11764.2547606326 | 22.549 |
| 11774.7751165178 | 22.709 |
| 11784.6346144969 | 21.139 |
| 11794.4908816515 | 21.915 |
| 11804.3439152796 | 21.666 |
| 11814.8502507079 | 22.809 |
| 11824.6965931554 | 22.179 |
| 11834.5396937953 | 22.123 |
| 11844.3795499289 | 22.622 |
| 11854.2161588588 | 23.09 |
| 11864.7049595387 | 23.502 |
| 11874.5348490359 | 22.513 |
| 11884.361483062 | 22.636 |
| 11894.184858923 | 23.28 |
| 11904.6595322518 | 22.91 |
| 11914.4761660384 | 24.119 |
| 11924.2895334037 | 23.867 |
| 11934.7535219068 | 24.672 |
| 11944.5601301438 | 23.136 |
| 11954.3634637119 | 22.471 |
| 11964.1635199234 | 22.543 |
| 11974.6132978134 | 23.036 |
| 11984.4065723084 | 23.762 |
| 11994.1965612104 | 22.594 |
| 12004.6355915615 | 22.214 |
| 12014.4187817337 | 24.017 |
| 12024.1986780849 | 22.283 |
| 12034.6269339824 | 22.538 |
| 12044.4000146079 | 22.091 |
| 12054.1697931929 | 21.473 |
| 12064.5872477498 | 21.175 |
| 12074.3501936309 | 21.086 |
| 12084.1098292605 | 21.655 |
| 12094.5164556177 | 20.796 |
| 12104.2692415828 | 18.812 |
| 12114.6685555396 | 19.321 |
| 12124.4144804202 | 19.798 |
| 12134.1570813238 | 19.498 |
| 12144.5455221836 | 19.281 |
| 12154.2812450717 | 19.201 |
| 12164.6623433005 | 19.179 |
| 12174.3911767731 | 18.006 |
| 12184.1166725673 | 18.563 |
| 12194.4868528803 | 16.916 |
| 12204.2054423576 | 18.716 |
| 12214.5682498623 | 18.026 |
| 12224.2799216428 | 17.614 |
| 12234.6353442048 | 17.21 |
| 12244.3400869166 | 17.127 |
| 12254.0414727732 | 16.858 |
| 12264.3859146897 | 18.174 |
| 12274.0803546181 | 17.611 |
| 12284.4173814892 | 18.886 |
| 12294.1048641378 | 17.3 |
| 12304.4344638595 | 18.253 |
| 12314.1149778847 | 18.989 |
| 12324.4371383615 | 16.494 |
| 12334.1106724279 | 18.198 |
| 12344.4253815731 | 17.517 |
| 12354.0919243535 | 18.996 |
| 12364.399170089 | 18.027 |
| 12374.0587102645 | 19.429 |
| 12384.3584805211 | 18.895 |
| 12394.0110067807 | 18.535 |
| 12404.303289498 | 18.816 |
| 12413.9487905391 | 19.564 |
| 12424.2335736652 | 19.735 |
| 12434.5144813222 | 19.675 |
| 12444.1493096855 | 19.841 |
| 12454.4226994961 | 20.562 |
| 12464.0504742385 | 20.82 |
| 12474.3163341731 | 19.782 |
| 12483.937044021 | 21.474 |
| 12494.1953620588 | 21.062 |
| 12504.4497828044 | 21.361 |
| 12514.0597598759 | 21.029 |
| 12524.3066205164 | 21.428 |
| 12533.9095043641 | 19.979 |
| 12544.1487929011 | 20.724 |
| 12554.3841685639 | 20.14 |
| 12563.9762767241 | 19.764 |
| 12574.2040621089 | 20.45 |
| 12584.4279252445 | 20.882 |
| 12594.0092318991 | 18.973 |
| 12604.2254866027 | 19.847 |
| 12613.7996547437 | 19.821 |
| 12624.0082890526 | 19.028 |
| 12634.2129855769 | 18.235 |
| 12643.7763094294 | 19.064 |
| 12653.973367439 | 19.59 |
| 12664.166478317 | 17.534 |
| 12674.355638884 | 18.878 |
| 12683.9043864043 | 18.719 |
| 12694.0858842004 | 18.287 |
| 12704.2634223526 | 18.427 |
| 12713.8012653864 | 17.559 |
| 12723.9711226959 | 18.288 |
| 12734.1370110396 | 16.396 |
| 12744.2989272465 | 18.808 |
| 12753.8221133645 | 17.727 |
| 12763.9763245372 | 17.97 |
| 12774.1265542653 | 18.201 |
| 12784.2727993827 | 18.221 |
| 12793.7812825299 | 17.554 |
| 12803.9197984588 | 18.361 |
| 12814.0543204837 | 18.681 |
| 12824.1848454434 | 17.776 |
| 12833.6785796357 | 18.691 |
| 12843.8013512901 | 18.326 |
| 12853.9201166002 | 17.644 |
| 12864.0348724098 | 16.616 |
| 12874.1456155638 | 17.662 |
| 12884.2523429083 | 17.645 |
| 12893.7237498195 | 16.85 |
| 12903.8226875631 | 18.008 |
| 12913.91760024 | 19.299 |
| 12924.0084847015 | 17.978 |
| 12934.0953377999 | 17.539 |
| 12944.1781563889 | 16.818 |
| 12953.627131865 | 17.175 |
| 12963.7021246429 | 18.832 |
| 12973.7730736762 | 17.441 |
| 12983.8399758234 | 18.108 |
| 12993.9028279444 | 17.11 |
| 13003.9616269003 | 16.011 |
| 13014.0163695534 | 16.16 |
| 13024.0670527675 | 16.871 |
| 13034.1136734073 | 16.556 |
| 13044.1562283392 | 16.402 |
| 13053.5674283134 | 18.321 |
| 13063.6020970228 | 16.917 |
| 13073.6326908259 | 17.624 |
| 13083.659206594 | 16.328 |
| 13093.6816411994 | 17.752 |
| 13103.6999915158 | 16.233 |
| 13113.7142544183 | 16.66 |
| 13123.7244267832 | 16.042 |
| 13133.7305054879 | 17.552 |
| 13143.7324874113 | 16.253 |
| 13153.7303694335 | 17.711 |
| 13163.7241484358 | 17.31 |
| 13173.713821301 | 16.467 |
| 13183.699384913 | 16.91 |
| 13193.6808361569 | 16.514 |
| 13203.6581719194 | 16.307 |
| 13213.6313890881 | 16.127 |
| 13223.6004845522 | 15.189 |
| 13233.565455202 | 16.256 |
| 13243.5262979291 | 15.651 |
| 13253.4830096265 | 16.231 |
| 13263.4355871885 | 15.8 |
| 13274.0056675904 | 14.893 |
| 13283.9497086947 | 15.541 |
| 13293.8896061601 | 15.099 |
| 13303.825356886 | 15.456 |
| 13313.7569577733 | 13.891 |
| 13323.6844057239 | 15.034 |
| 13333.6076976412 | 13.814 |
| 13343.5268304299 | 13.881 |
| 13353.4418009959 | 15.683 |
| 13363.9718932025 | 15.484 |
| 13373.878269418 | 13.851 |
| 13383.7804739434 | 15.302 |
| 13393.6785036898 | 13.296 |
| 13403.5723555698 | 14.286 |
| 13413.4620264972 | 13.217 |
| 13423.3475133871 | 14.36 |
| 13433.8462552957 | 12.95 |
| 13443.7231028713 | 14.468 |
| 13453.5957569702 | 14.048 |
| 13463.4642145127 | 11.821 |
| 13473.3284724207 | 13.236 |
| 13483.8046414536 | 11.577 |
| 13493.6602278992 | 12.224 |
| 13503.5116052912 | 12.084 |
| 13513.3587705567 | 11.965 |
| 13523.8167649756 | 10.738 |
| 13533.655233031 | 11.473 |
| 13543.4894795573 | 10.729 |
| 13553.3195014869 | 12.791 |
| 13563.7592674536 | 12.003 |
| 13573.5805664701 | 11.259 |
| 13583.3976315036 | 11.656 |
| 13593.8236204883 | 10.391 |
| 13603.6319432623 | 11.372 |
| 13613.4360226796 | 11.763 |
| 13623.8482041804 | 13.013 |
| 13633.6435220174 | 12.288 |
| 13643.434587136 | 13.039 |
| 13653.2213964822 | 12.49 |
| 13663.6152149349 | 11.727 |
| 13673.3932371108 | 12.579 |
| 13683.7777123006 | 14.443 |
| 13693.5469343315 | 12.366 |
| 13703.3118849585 | 11.77 |
| 13713.6824614022 | 11.844 |
| 13723.4385926405 | 13.87 |
| 13733.1904431509 | 12.774 |
| 13743.5470905088 | 13.367 |
| 13753.2901024125 | 12.879 |
| 13763.6373518812 | 13.349 |
| 13773.3715122501 | 15.035 |
| 13783.7093500997 | 13.902 |
| 13793.4346460174 | 15.191 |
| 13803.1556393735 | 15.376 |
| 13813.4794770924 | 15.526 |
| 13823.19158684 | 13.697 |
| 13833.5059788772 | 15.814 |
| 13843.2091921294 | 18.24 |
| 13853.5141247985 | 17.565 |
| 13863.2084286799 | 16.522 |
| 13873.5038883072 | 17.66 |
| 13883.1892699542 | 16.257 |
| 13893.4752428786 | 16.079 |
| 13903.1516894396 | 16.13 |
| 13913.4281620125 | 17.967 |
| 13923.0956606477 | 18.246 |
| 13933.362619233 | 19.711 |
| 13943.6246713556 | 19.761 |
| 13953.2785880888 | 19.201 |
| 13963.5311055873 | 18.571 |
| 13973.1760421532 | 22.797 |
| 13983.4190114235 | 21.655 |
| 13993.0549550241 | 21.581 |
| 14003.2883624745 | 22.965 |
| 14013.5168388388 | 22.412 |
| 14023.1391323755 | 21.912 |
| 14033.3580263509 | 22.275 |
| 14043.5719786515 | 27.331 |
| 14053.1805928131 | 24.763 |
| 14063.384942184999 | 25.955 |
| 14073.5843393085 | 26.125 |
| 14083.1792448255 | 27.167 |
| 14093.3690185096 | 26.146 |
| 14103.5538293869 | 30.3 |
| 14113.1349970315 | 28.562 |
| 14123.3101639881 | 29.385 |
| 14133.4803575944 | 29.725 |
| 14143.0477581808 | 30.303 |
| 14153.2082874145 | 30.052 |
| 14163.3638327696 | 30.085 |
| 14173.51439067 | 31.656 |
| 14183.0632977139 | 31.608 |
| 14193.2041638824 | 32.133 |
| 14203.3400320881 | 31.845 |
| 14213.470898762 | 31.877 |
| 14223.0012600337 | 31.799 |
| 14233.1224076693 | 31.978 |
| 14243.2385432855 | 31.965 |
| 14253.34966332 | 32.352 |
| 14263.4557642124 | 32.353 |
| 14272.9628004342 | 32.569 |
| 14283.0591481285 | 32.603 |
| 14293.1504662188 | 32.733 |
| 14303.2367511516 | 32.866 |
| 14313.3179993751 | 32.835 |
| 14323.3942073394 | 32.904 |
| 14332.8730897597 | 32.897 |
| 14342.9395035638 | 32.879 |
| 14353.0008666779 | 32.944 |
| 14363.0571755588 | 33.022 |
| 14373.1084266655 | 33.039 |
| 14383.1546164584 | 32.974 |
| 14393.1957413999 | 32.946 |
| 14403.2317979542 | 32.836 |
| 14413.2627825872 | 32.909 |
| 14423.2886917666 | 32.883 |
| 14433.309521962 | 32.87 |
| 14443.3252696445 | 32.841 |
| 14453.3359312873 | 32.782 |
| 14463.3415033652 | 32.725 |
| 14473.3419823549 | 32.657 |
| 14483.3373647349 | 32.595 |
| 14493.3276469853 | 32.483 |
| 14503.3128255883 | 32.441 |
| 14513.2928970277 | 32.514 |
| 14523.2678577892 | 32.589 |
| 14533.2377043601 | 32.503 |
| 14543.2024332297 | 32.54 |
| 14553.1620408891 | 32.431 |
| 14563.116523831 | 32.449 |
| 14573.0658785502 | 32.427 |
| 14583.0101015432 | 32.362 |
| 14592.9491893081 | 32.365 |
| 14602.883138345 | 32.273 |
| 14612.8119451559 | 32.269 |
| 14622.7356062443 | 32.225 |
| 14633.2373995598 | 32.181 |
| 14643.1504555126 | 32.132 |
| 14653.0583550596 | 32.117 |
| 14662.961094712 | 32.101 |
| 14672.8586709826 | 32.057 |
| 14682.7510803861 | 32.127 |
| 14693.2197606474 | 32.101 |
| 14703.1015214165 | 32.097 |
| 14712.978104669 | 32.047 |
| 14722.8495069267 | 32.046 |
| 14732.7157247137 | 32.056 |
| 14743.1566534981 | 32.035 |
| 14753.012186437 | 31.994 |
| 14762.8625242837 | 31.991 |
| 14772.7076635696 | 31.967 |
| 14783.1262585915 | 31.958 |
| 14792.9606840437 | 31.938 |
| 14802.7899003363 | 31.944 |
| 14812.6139040081 | 31.915 |
| 14823.010104828 | 31.896 |
| 14832.8233657426 | 31.872 |
| 14842.6314034605 | 31.862 |
| 14853.0106876316 | 31.867 |
| 14862.807960836 | 31.813 |
| 14872.600000285 | 31.783 |
| 14882.9623336103 | 31.728 |
| 14892.743586825 | 31.7 |
| 14903.0944917003 | 31.684 |
| 14912.8649440811 | 31.686 |
| 14922.6301450796 | 31.671 |
| 14932.9640420196 | 31.587 |
| 14942.7184205228 | 31.622 |
| 14953.0408506401 | 31.642 |
| 14962.7843920884 | 31.583 |
| 14972.5226645759 | 31.581 |
| 14982.8280298254 | 31.596 |
| 14992.5554436565 | 31.622 |
| 15002.8493038162 | 31.636 |
| 15012.5658444714 | 31.554 |
| 15022.8481841764 | 31.463 |
| 15032.5538371526 | 31.425 |
| 15042.8246410553 | 31.378 |
| 15052.5193918656 | 31.375 |
| 15062.7786446354 | 31.385 |
| 15072.4624788092 | 31.36 |
| 15082.7101651331 | 31.314 |
| 15092.9518970418 | 31.312 |
| 15102.6191727978 | 31.253 |
| 15112.8493151048 | 31.252 |
| 15122.5056379131 | 31.24 |
| 15132.7241753485 | 31.247 |
| 15142.9367386241 | 31.209 |
| 15152.5764481072 | 31.189 |
| 15162.7773834215 | 31.181 |
| 15172.4061037489 | 31.14 |
| 15182.5953958757 | 31.122 |
| 15192.7786941542 | 31.106 |
| 15202.3907464058 | 31.097 |
| 15212.5623784731 | 31.062 |
| 15222.7280048618 | 31.071 |
| 15232.8876215585 | 31.024 |
| 15242.4772933323 | 30.992 |
| 15252.6252130373 | 30.98 |
| 15262.7671112475 | 30.975 |
| 15272.902983959 | 30.971 |
| 15282.4702163522 | 30.946 |
| 15292.5943613634 | 30.877 |
| 15302.7124691005 | 30.834 |
| 15312.8245355691 | 30.84 |
| 15322.369269817 | 30.834 |
| 15332.4695779488 | 30.831 |
| 15342.5638330643 | 30.836 |
| 15352.6520311787 | 30.797 |
| 15362.7341683091 | 30.755 |
| 15372.8102404754 | 30.723 |
| 15382.3209583598 | 30.694 |
| 15392.3852261552 | 30.701 |
| 15402.4434172806 | 30.708 |
| 15412.4955277653 | 30.666 |
| 15422.5415536408 | 30.658 |
| 15432.5814909412 | 30.634 |
| 15442.6153357028 | 30.619 |
| 15452.6430839644 | 30.623 |
| 15462.6647317673 | 30.596 |
| 15472.680275155 | 30.592 |
| 15482.6897101736 | 30.585 |
| 15492.6930328715 | 30.558 |
| 15502.6902392996 | 30.557 |
| 15512.681325511 | 30.525 |
| 15522.6662875615 | 30.519 |
| 15532.6451215092 | 30.472 |
| 15542.6178234146 | 30.474 |
| 15552.5843893407 | 30.459 |
| 15562.5448153527 | 30.437 |
| 15572.4990975185 | 30.433 |
| 15582.4472319083 | 30.394 |
| 15592.3892145947 | 30.399 |
| 15602.3250416527 | 30.383 |
| 15612.25470916 | 30.361 |
| 15622.1782131963 | 30.35 |
| 15632.6463320785 | 30.332 |
| 15642.5571544576 | 30.284 |
| 15652.4618014028 | 30.241 |
| 15662.360269004 | 30.225 |
| 15672.2525533534 | 30.191 |
| 15682.1386505457 | 30.19 |
| 15692.5672587456 | 30.165 |
| 15702.4406256387 | 30.14 |
| 15712.307793457 | 30.109 |
| 15722.1687583049 | 30.074 |
| 15732.5708207748 | 30.056 |
| 15742.4190228499 | 30.028 |
| 15752.2610100672 | 30 |
| 15762.0967785414 | 29.972 |
| 15772.4722277383 | 29.931 |
| 15782.2952010488 | 29.911 |
| 15792.1119437591 | 29.883 |
| 15802.4672973501 | 29.848 |
| 15812.2712205476 | 29.818 |
| 15822.0689013107 | 29.794 |
| 15832.4041211274 | 29.763 |
| 15842.1889580757 | 29.712 |
| 15852.5106119152 | 29.667 |
| 15862.2825887268 | 29.607 |
| 15872.0483033605 | 29.547 |
| 15882.3497597461 | 29.492 |
| 15892.1025900204 | 29.423 |
| 15902.3904376598 | 29.363 |
| 15912.1303673061 | 29.288 |
| 15922.4045890384 | 29.208 |
| 15932.1316018097 | 29.1 |
| 15942.3921804965 | 28.997 |
| 15952.1062601673 | 28.897 |
| 15962.3531786932 | 28.792 |
| 15972.0543090597 | 28.677 |
| 15982.2875503319 | 28.554 |
| 15991.9757152117 | 28.433 |
| 16002.1952621603 | 5.851 |
| 16012.4077702628 | 6.176 |
| 16022.0762809707 | 4.912 |
| 16032.2750689575 | 4.346 |
| 16042.4668048669 | 4.399 |
| 16052.1156244585 | 3.776 |
| 16062.2936145125 | 3.782 |
| 16071.9294036701 | 3.363 |
| 16082.0936308911 | 3.289 |
| 16092.2507841211 | 3.183 |
| 16102.4008588924 | 3.224 |
| 16112.0101857189 | 3.116 |
| 16122.1464633132 | 2.918 |
| 16132.2756492987 | 2.767 |
| 16142.3977392198 | 2.626 |
| 16151.9805378539 | 2.52 |
| 16162.0887963487 | 2.372 |
| 16172.1899456653 | 2.247 |
| 16182.2839813605 | 2.326 |
| 16192.3708989943 | 2.371 |
| 16201.9203562373 | 2.325 |
| 16211.9933996528 | 2.303 |
| 16222.0593119387 | 2.212 |
| 16232.1180886674 | 2.172 |
| 16242.1697254142 | 2.234 |
| 16252.2142177578 | 2.252 |
| 16262.2515612799 | 2.318 |
| 16272.2817515655 | 2.241 |
| 16282.3047842025 | 2.21 |
| 16292.3206547823 | 2.137 |
| 16301.8027637347 | 2.202 |
| 16311.8046745097 | 2.175 |
| 16321.7994102513 | 2.14 |
| 16331.7869665632 | 2.086 |
| 16342.2924227337 | 2.244 |
| 16352.2652285611 | 2.265 |
| 16362.2308415579 | 2.211 |
| 16372.1892573405 | 2.162 |
| 16382.1404715285 | 2.202 |
| 16392.0844797448 | 2.178 |
| 16402.0212776151 | 2.222 |
| 16411.9508607688 | 2.172 |
| 16421.873224838 | 2.149 |
| 16431.7883654583 | 2.198 |
| 16442.2175470646 | 2.207 |
| 16452.1178469451 | 2.304 |
| 16462.0109100729 | 2.355 |
| 16471.8967320966 | 2.338 |
| 16481.7753086676 | 2.33 |
| 16492.1659780473 | 2.298 |
| 16502.0296687633 | 2.308 |
| 16511.8861007721 | 2.338 |
| 16521.7352697382 | 2.335 |
| 16532.0949647555 | 2.371 |
| 16541.9292118014 | 2.36 |
| 16551.7561825896 | 2.318 |
| 16562.0924968379 | 2.343 |
| 16571.9045186109 | 2.341 |
| 16581.709250941 | 2.308 |
| 16592.0221420525 | 2.347 |
| 16601.8118983338 | 2.373 |
| 16612.1090156306 | 2.385 |
| 16621.8837777198 | 2.361 |
| 16631.6512283819 | 2.38 |
| 16641.9248519 | 2.42 |
| 16651.6772814391 | 2.438 |
| 16661.9350837325 | 2.449 |
| 16671.137630634 | 2.464 |
| 16682.0567109542 | 2.479 |
| 16692.975466049 | 2.496 |
| 16701.164318813 | 2.55 |
| 16712.0825042514 | 2.586 |
| 16723.0003638792 | 2.628 |
| 16731.1885446587 | 2.649 |
| 16742.1058336057 | 2.643 |
| 16753.0227961567 | 2.692 |
| 16761.2103037445 | 2.705 |
| 16772.1266945904 | 2.74 |
| 16783.0427584551 | 2.77 |
| 16791.2295916441 | 2.802 |
| 16802.1450827795 | 2.84 |
| 16813.0602463485 | 2.884 |
| 16821.2464039316 | 2.91 |
| 16832.1609937472 | 2.943 |
| 16843.0752554112 | 2.982 |
| 16851.2607361816 | 3.018 |
| 16862.1744230681 | 3.062 |
| 16873.0877812179 | 3.101 |
| 16881.2725839688 | 3.16 |
| 16892.1853663172 | 3.203 |
| 16900.3697369728 | 3.241 |
| 16911.2819428684 | 3.296 |
| 16922.1938190699 | 3.344 |
| 16930.3775097312 | 3.399 |
| 16941.2888084561 | 3.451 |
| 16952.1997769018 | 3.499 |
| 16960.3827863624 | 3.554 |
| 16971.2931763077 | 3.597 |
| 16982.203235389 | 3.657 |
| 16990.3855624424 | 3.717 |
| 17001.2950419997 | 3.789 |
| 17012.2041901079 | 3.846 |
| 17020.3858335478 | 3.898 |
| 17031.2944011086 | 3.951 |
| 17042.2026366355 | 3.998 |
| 17050.3835952555 | 4.052 |
| 17061.2912492115 | 4.101 |
| 17072.1985705488 | 4.162 |
| 17080.3788431429 | 4.221 |
| 17091.2855818858 | 4.281 |
| 17102.1919874254 | 4.328 |
| 17110.3715727875 | 4.385 |
| 17121.2773947094 | 4.441 |
| 17132.1828828433 | 4.497 |
| 17140.3617797673 | 4.563 |
| 17151.2666832604 | 4.631 |
| 17162.1712523807 | 4.688 |
| 17170.3494596609 | 4.748 |
| 17181.2534431173 | 4.803 |
| 17192.1570916163 | 4.865 |
| 17200.3346080469 | 4.928 |
| 17211.237669859 | 4.98 |
| 17222.1403961292 | 5.033 |
| 17230.3172205045 | 5.08 |
| 17241.2193590648 | 5.138 |
| 17252.1211614987 | 5.205 |
| 17260.2972926133 | 5.26 |
| 17271.1985063144 | 5.313 |
| 17282.0993833047 | 5.381 |
| 17290.274819953 | 5.435 |
| 17301.1751071878 | 5.489 |
| 17312.0750571273 | 5.539 |
| 17320.2497981041 | 5.587 |
| 17331.1491572654 | 5.644 |
| 17342.0481785471 | 5.694 |
| 17350.222222647 | 5.737 |
| 17361.120652128 | 5.792 |
| 17372.018743145 | 5.846 |
| 17380.192089163 | 5.892 |
| 17391.0895873567 | 5.932 |
| 17401.9867465023 | 5.981 |
| 17410.1593932332 | 6.026 |
| 17421.0559585331 | 6.074 |
| 17431.9521842006 | 6.117 |
| 17440.1241304396 | 6.177 |
| 17451.0197612391 | 6.23 |
| 17461.915051822 | 6.275 |
| 17470.0862963642 | 6.311 |
| 17480.980991057 | 6.35 |
| 17491.875344949 | 6.394 |
| 17500.0458865897 | 6.433 |
| 17510.9396435694 | 6.474 |
| 17521.8330591642 | 6.509 |
| 17532.726133162 | 6.549 |
| 17540.8957143594 | 6.583 |
| 17551.7881900511 | 6.626 |
| 17562.6803235616 | 7.655 |
| 17570.8491990104 | 7.673 |
| 17581.740733193 | 7.695 |
| 17592.6319246105 | 7.715 |
| 17600.8000931063 | 7.735 |
| 17611.690684174 | 7.756 |
| 17622.5809318927 | 7.776 |
| 17630.7483922312 | 7.796 |
| 17641.6380385784 | 7.817 |
| 17652.5273409927 | 7.837 |
| 17660.6940919698 | 7.857 |
| 17671.5827919908 | 7.878 |
| 17682.4711474953 | 7.897 |
| 17690.6371879069 | 7.917 |
| 17701.5249399965 | 8.364 |
| 17712.4123469858 | 8.742 |
| 17720.577675628 | 9.075 |
| 17731.4644781809 | 9.374 |
| 17742.3509350498 | 9.64 |
| 17750.5155507187 | 9.875 |
| 17761.4014021299 | 10.09 |
| 17772.2869072734 | 10.281 |
| 17780.4508087652 | 10.46 |
| 17791.3357074296 | 10.625 |
| 17802.2202592428 | 10.773 |
| 17810.3834453539 | 10.907 |
| 17821.2673896668 | 11.028 |
| 17832.1509865449 | 11.141 |
| 17840.3134560718 | 11.247 |
| 17851.1964444285 | 11.348 |
| 17862.0790847669 | 11.444 |
| 17870.2408365061 | 11.531 |
| 17881.1228673021 | 11.74 |
| 17892.0045494964 | 11.938 |
| 17900.1655822446 | 12.125 |
| 17911.0466538754 | 12.302 |
| 17921.9273763211 | 12.47 |
| 17930.0876888751 | 12.629 |
| 17940.9677997366 | 12.781 |
| 17951.8475608296 | 12.926 |
| 17960.0071519863 | 13.065 |
| 17970.8863004742 | 13.197 |
| 17981.7650986105 | 13.324 |
| 17989.9239671668 | 13.446 |
| 18000.8021516773 | 13.562 |
| 18011.6799852529 | 13.674 |
| 18019.838130006 | 13.782 |
| 18030.7153489352 | 13.885 |
| 18041.5922163464 | 13.985 |
| 18049.7496360934 | 14.081 |
| 18060.6258878377 | 14.173 |
| 18071.5017874808 | 14.262 |
| 18082.3773348106 | 14.349 |
| 18090.5337639749 | 14.432 |
| 18101.4086942464 | 14.513 |
| 18112.2832716216 | 14.592 |
| 18120.4389729373 | 14.667 |
| 18131.3129322339 | 14.741 |
| 18142.1865380512 | 14.812 |
| 18150.3415103159 | 14.882 |
| 18161.2144970344 | 14.949 |
| 18172.0871296906 | 15.014 |
| 18180.241371702 | 15.078 |
| 18191.1133842393 | 15.14 |
| 18201.9850421315 | 15.2 |
| 18210.1385526873 | 15.259 |
| 18221.0095894405 | 15.316 |
| 18231.8802709658 | 15.372 |
| 18240.0330488639 | 15.426 |
| 18250.9031082303 | 15.479 |
| 18261.7728117859 | 15.531 |
| 18269.9248558244 | 15.582 |
| 18280.7939362013 | 15.631 |
| 18291.6626601847 | 15.68 |
| 18299.8139691616 | 15.727 |
| 18310.6820689465 | 15.773 |
| 18321.5498117553 | 15.818 |
| 18329.7003844688 | 15.862 |
| 18340.5675020595 | 15.905 |
| 18351.4342620914 | 15.947 |
| 18359.5840973399 | 15.989 |
| 18370.450231134 | 16.029 |
| 18381.3160067868 | 16.069 |
| 18392.1814240864 | 16.108 |
| 18400.3302517644 | 16.146 |
| 18411.1950414361 | 16.183 |
| 18422.0594721721 | 16.22 |
| 18430.2075595452 | 16.256 |
| 18441.071361634 | 16.291 |
| 18451.9348042047 | 16.326 |
| 18460.0821500714 | 16.36 |
| 18470.9449629757 | 16.393 |
| 18481.8074157793 | 16.425 |
| 18489.9540189387 | 16.457 |
| 18500.8158410567 | 16.489 |
| 18511.6773024919 | 16.52 |
| 18519.8231617427 | 16.55 |
| 18530.6839914732 | 16.58 |
| 18541.5444599384 | 16.609 |
| 18549.6895740797 | 16.638 |
| 18560.5494098214 | 16.666 |
| 18571.4088837155 | 16.694 |
| 18579.5532515464 | 16.722 |
| 18590.4120916981 | 16.749 |
| 18601.2705694202 | 16.775 |
| 18612.1286845008 | 16.801 |
| 18620.2720327006 | 16.827 |
| 18631.1295126496 | 16.852 |
| 18641.9866293751 | 16.883 |
| 18650.1292284265 | 16.913 |
| 18660.9857090017 | 16.943 |
| 18671.8418257713 | 16.972 |
| 18679.9836744738 | 17.001 |
| 18690.8391540745 | 17.029 |
| 18701.6942692876 | 17.057 |
| 18709.8353664409 | 17.084 |
| 18720.6898434666 | 17.111 |
| 18731.5439555229 | 17.137 |
| 18739.6842999266 | 17.163 |
| 18750.537772777 | 17.189 |
| 18761.3908800761 | 17.214 |
| 18769.5304705301 | 17.239 |
| 18780.3829376051 | 17.264 |
| 18791.2350385469 | 17.288 |
| 18799.3738738511 | 17.312 |
| 18810.2253335507 | 17.336 |
| 18821.0764265352 | 17.359 |
| 18831.9271525932 | 17.382 |
| 18840.0649562138 | 17.405 |
| 18850.9150396413 | 17.427 |
| 18861.7647555604 | 17.449 |
| 18869.9018011952 | 17.471 |
| 18880.7508734659 | 17.492 |
| 18891.5995776466 | 17.513 |
| 18899.7358640959 | 17.534 |
| 18910.5839236103 | 17.555 |
| 18921.4316144531 | 17.575 |
| 18929.5671405172 | 17.595 |
| 18940.4141856759 | 17.615 |
| 18951.2608615814 | 17.635 |
| 18959.395626061 | 17.654 |
| 18970.2416552648 | 17.674 |
| 18981.0873146339 | 17.693 |
| 18989.2213163296 | 17.711 |
| 19000.0663279794 | 17.73 |
| 19010.910969213 | 17.749 |
| 19021.7552398192 | 17.767 |
| 19029.8881994224 | 17.785 |
| 19040.7318209217 | 17.803 |
| 19051.5750712122 | 17.82 |
| 19059.7072651971 | 17.838 |
| 19070.5498653634 | 17.855 |
| 19081.3920937395 | 17.872 |
| 19089.5235209071 | 17.89 |
| 19100.3650981418 | 17.906 |
| 19111.206303005 | 17.923 |
| 19119.3369621565 | 17.94 |
| 19130.1775148611 | 17.956 |
| 19141.017694613 | 17.973 |
| 19149.1475845497 | 17.989 |
| 19159.9871111259 | 18.005 |
| 19170.8262641684 | 18.021 |
| 19181.6650434657 | 18.037 |
| 19189.7938825413 | 18.053 |
| 19200.6320072762 | 18.068 |
| 19211.4697576849 | 18.084 |
| 19219.5978247128 | 18.099 |
| 19230.4349195422 | 18.114 |
| 19241.2716394644 | 18.13 |
| 19249.3989332461 | 18.145 |
| 19260.2349965723 | 18.16 |
| 19271.0706844103 | 18.175 |
| 19279.1972037476 | 18.19 |
| 19290.0322339729 | 18.205 |
| 19300.8668881291 | 18.219 |
| 19311.701166005 | 18.234 |
| 19319.8266273509 | 18.249 |
| 19330.660246228 | 18.263 |
| 19341.4934882438 | 18.278 |
| 19349.6181723136 | 18.292 |
| 19360.4507543142 | 18.307 |
| 19371.2829588729 | 18.321 |
| 19379.4068644686 | 18.335 |
| 19390.2384079957 | 18.349 |
| 19401.0695735001 | 18.364 |
| 19409.192699424 | 18.378 |
| 19420.0232028807 | 18.392 |
| 19430.853327734 | 18.406 |
| 19438.9756727885 | 18.42 |
| 19449.8051345779 | 18.434 |
| 19460.6342171833 | 18.448 |
| 19471.4629203936 | 18.462 |
| 19479.5841986963 | 18.475 |
| 19490.4122374573 | 18.489 |
| 19501.2398962426 | 18.503 |
| 19509.3603908457 | 18.517 |
| 19520.1873841657 | 18.53 |
| 19531.0139969297 | 18.544 |
| 19539.1337066357 | 18.558 |
| 19549.9596529187 | 18.572 |
| 19560.785218065 | 18.585 |
| 19568.904141677 | 18.599 |
| 19579.7290393266 | 18.613 |
| 19590.5535552593 | 18.626 |
| 19601.3776892641 | 18.64 |
| 19609.4955390006 | 18.653 |
| 19620.3190041237 | 18.667 |
| 19631.1420867386 | 18.68 |
| 19639.2591475519 | 18.694 |
| 19650.0815602697 | 18.708 |
| 19660.9035898991 | 18.721 |
| 19669.0198605924 | 18.735 |
| 19679.8412193093 | 18.748 |
| 19690.6621943576 | 18.762 |
| 19701.4827855262 | 18.775 |
| 19709.5979768548 | 18.789 |
| 19720.4178957266 | 18.802 |
| 19731.2374301387 | 18.816 |
| 19739.3518285192 | 18.829 |
| 19750.1706896192 | 18.843 |
| 19760.9891656795 | 18.856 |
| 19769.1027699155 | 18.869 |
| 19779.9205716488 | 18.883 |
| 19790.7379877623 | 18.896 |
| 19798.8507966576 | 18.909 |
| 19809.6675374291 | 18.923 |
| 19820.483892001 | 18.936 |
| 19831.2998601623 | 18.949 |
| 19839.4115825745 | 18.962 |
| 19850.22687401 | 18.976 |
| 19861.0417784551 | 18.989 |
| 19869.1527026996 | 19.002 |
| 19879.9669294042 | 19.015 |
| 19890.7807685386 | 19.028 |
| 19898.8908934196 | 19.041 |
| 19909.7040537989 | 19.054 |
| 19920.5168260282 | 19.067 |
| 19931.3292098968 | 19.079 |
| 19939.4382428098 | 19.092 |
| 19950.2499465399 | 19.105 |
| 19961.0612613296 | 19.118 |
| 19969.1694920529 | 19.13 |
| 19979.9801256898 | 19.142 |
| 19990.7903698067 | 19.153 |
| 19998.897797145 | 19.165 |